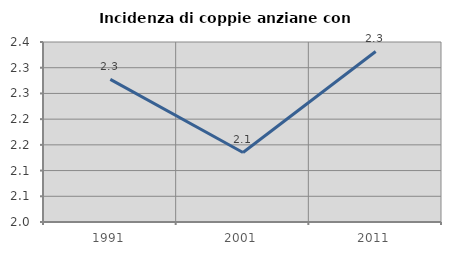
| Category | Incidenza di coppie anziane con figli |
|---|---|
| 1991.0 | 2.277 |
| 2001.0 | 2.135 |
| 2011.0 | 2.332 |